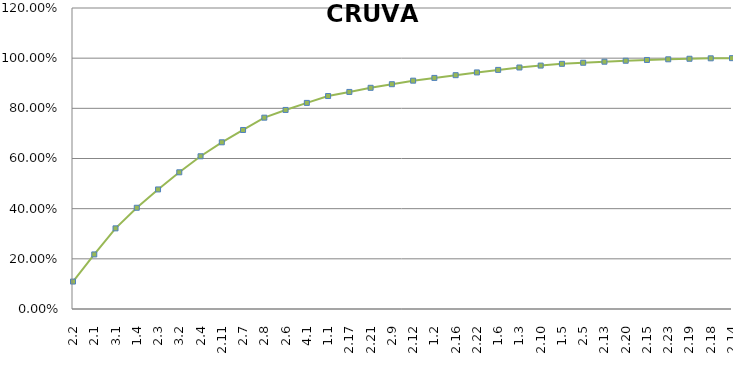
| Category | Series 0 |
|---|---|
| 2.2 | 0.109 |
| 2.1 | 0.218 |
| 3.1 | 0.322 |
| 1.4 | 0.404 |
| 2.3 | 0.477 |
| 3.2 | 0.545 |
| 2.4 | 0.609 |
| 2.11 | 0.665 |
| 2.7 | 0.714 |
| 2.8 | 0.763 |
| 2.6 | 0.794 |
| 4.1 | 0.822 |
| 1.1 | 0.849 |
| 2.17 | 0.865 |
| 2.21 | 0.882 |
| 2.9 | 0.896 |
| 2.12 | 0.91 |
| 1.2 | 0.921 |
| 2.16 | 0.932 |
| 2.22 | 0.943 |
| 1.6 | 0.953 |
| 1.3 | 0.963 |
| 2.10 | 0.97 |
| 1.5 | 0.977 |
| 2.5 | 0.982 |
| 2.13 | 0.986 |
| 2.20 | 0.99 |
| 2.15 | 0.993 |
| 2.23 | 0.995 |
| 2.19 | 0.998 |
| 2.18 | 0.999 |
| 2.14 | 1 |